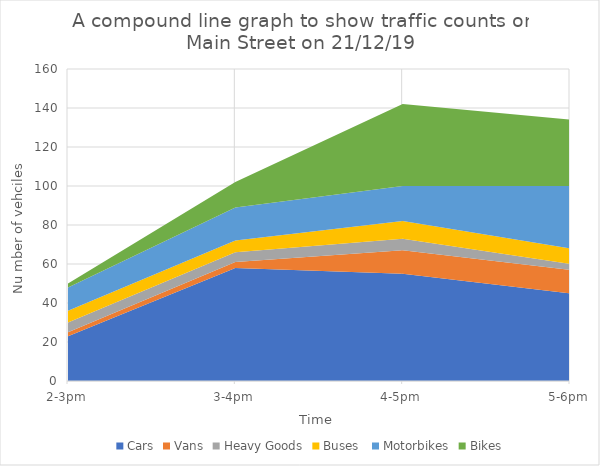
| Category | Cars | Vans | Heavy Goods | Buses  | Motorbikes | Bikes |
|---|---|---|---|---|---|---|
| 2-3pm | 23 | 2 | 5 | 6 | 12 | 2 |
| 3-4pm | 58 | 3 | 5 | 6 | 17 | 13 |
| 4-5pm | 55 | 12 | 6 | 9 | 18 | 42 |
| 5-6pm | 45 | 12 | 3 | 8 | 32 | 34 |